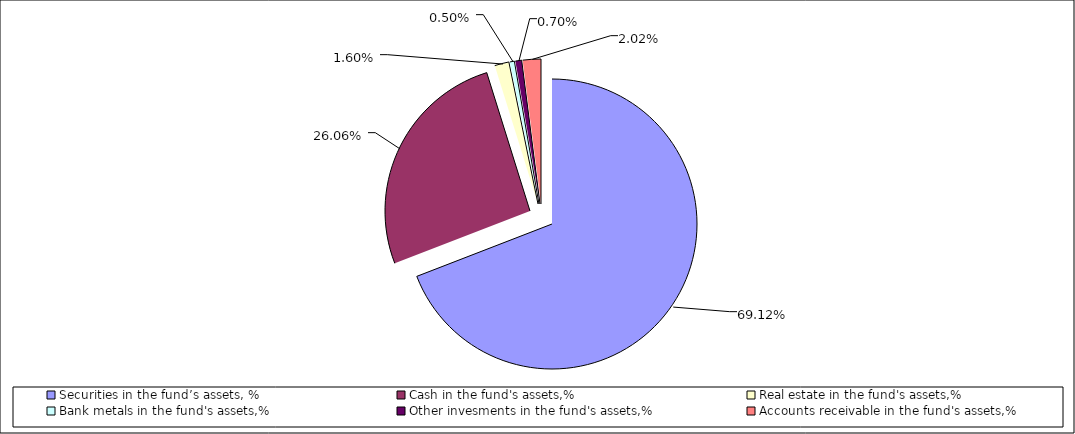
| Category | Series 0 |
|---|---|
| Securities in the fund’s assets, % | 0.691 |
| Cash in the fund's assets,% | 0.261 |
| Real estate in the fund's assets,% | 0.016 |
| Bank metals in the fund's assets,% | 0.005 |
| Other invesments in the fund's assets,%     | 0.007 |
| Accounts receivable in the fund's assets,%    | 0.02 |